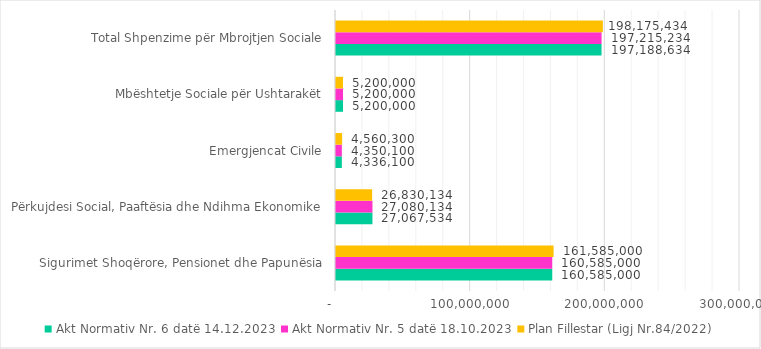
| Category | Akt Normativ Nr. 6 datë 14.12.2023 | Akt Normativ Nr. 5 datë 18.10.2023 | Plan Fillestar (Ligj Nr.84/2022) |
|---|---|---|---|
| Sigurimet Shoqërore, Pensionet dhe Papunësia | 160585000 | 160585000 | 161585000 |
| Përkujdesi Social, Paaftësia dhe Ndihma Ekonomike | 27067534 | 27080134 | 26830134 |
| Emergjencat Civile | 4336100 | 4350100 | 4560300 |
| Mbështetje Sociale për Ushtarakët | 5200000 | 5200000 | 5200000 |
| Total Shpenzime për Mbrojtjen Sociale | 197188634 | 197215234 | 198175434 |